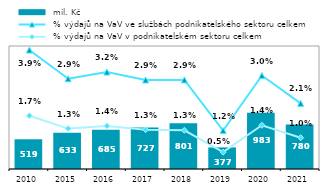
| Category |  mil. Kč |
|---|---|
| 2010.0 | 519.388 |
| 2015.0 | 632.822 |
| 2016.0 | 685.294 |
| 2017.0 | 727.041 |
| 2018.0 | 800.583 |
| 2019.0 | 377.268 |
| 2020.0 | 982.945 |
| 2021.0 | 779.652 |